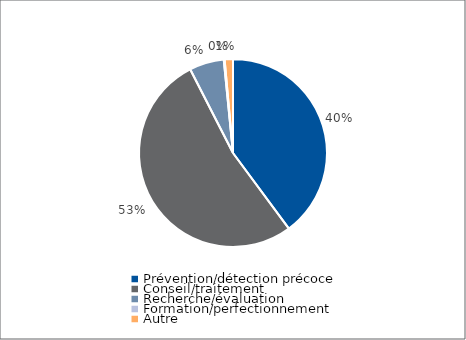
| Category | Series 0 |
|---|---|
| Prévention/détection précoce | 180409 |
| Conseil/traitement | 238068 |
| Recherche/évaluation | 26926 |
| Formation/perfectionnement | 671 |
| Autre | 6459 |